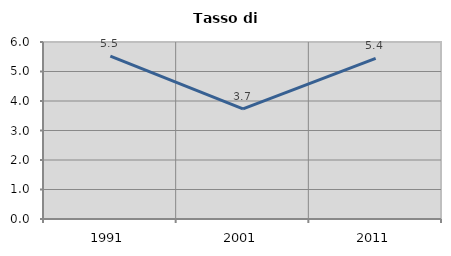
| Category | Tasso di disoccupazione   |
|---|---|
| 1991.0 | 5.52 |
| 2001.0 | 3.73 |
| 2011.0 | 5.447 |